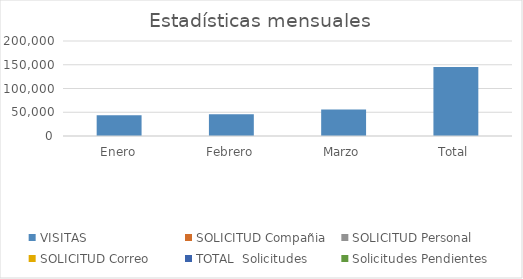
| Category | VISITAS | SOLICITUD Compañia | SOLICITUD Personal | SOLICITUD Correo | TOTAL  Solicitudes | Solicitudes Pendientes |
|---|---|---|---|---|---|---|
| Enero | 43626 | 0 | 0 | 0 | 0 | 0 |
| Febrero | 45822 | 0 | 0 | 0 | 0 | 0 |
| Marzo | 55620 | 0 | 0 | 0 | 0 | 0 |
| Total | 145068 | 0 | 0 | 0 | 0 | 0 |